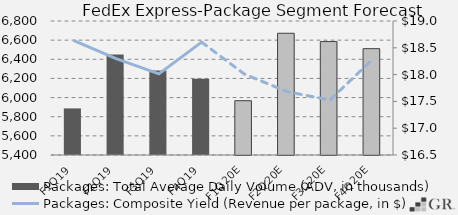
| Category | Packages: Total Average Daily Volume (ADV, in thousands) |
|---|---|
|  F1Q19  | 5886.7 |
|  F2Q19  | 6449.5 |
|  F3Q19  | 6283.4 |
|  F4Q19  | 6195.344 |
|  F1Q20E  | 5967.306 |
|  F2Q20E  | 6671.942 |
|  F3Q20E  | 6585.011 |
|  F4Q20E  | 6510.956 |